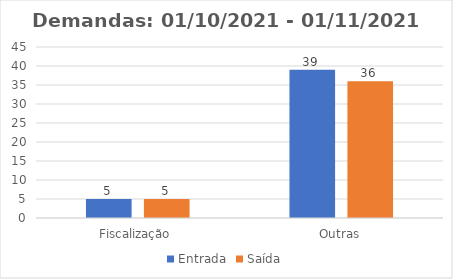
| Category | Entrada | Saída |
|---|---|---|
| Fiscalização | 5 | 5 |
| Outras | 39 | 36 |